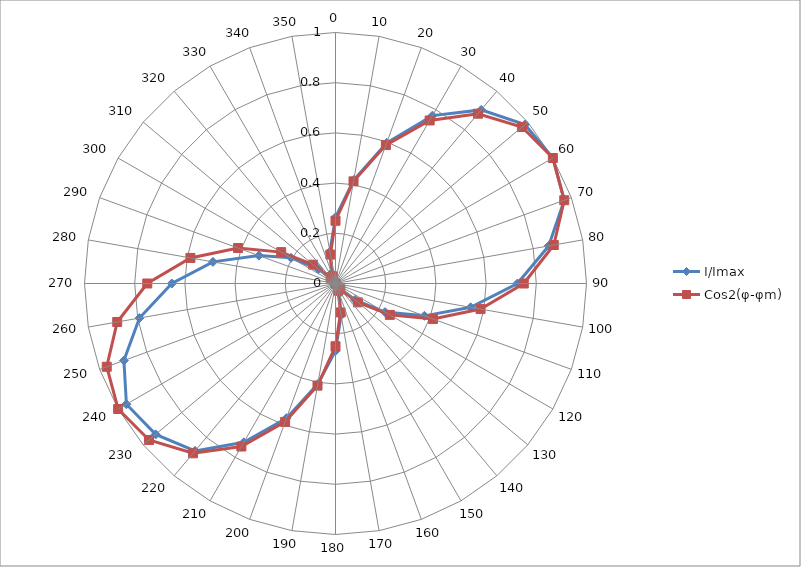
| Category | I/Imax | Cos2(φ-φm) |
|---|---|---|
| 0.0 | 0.264 | 0.25 |
| 10.0 | 0.418 | 0.413 |
| 20.0 | 0.597 | 0.587 |
| 30.0 | 0.772 | 0.75 |
| 40.0 | 0.903 | 0.883 |
| 50.0 | 0.985 | 0.97 |
| 60.0 | 1 | 1 |
| 70.0 | 0.97 | 0.97 |
| 80.0 | 0.862 | 0.883 |
| 90.0 | 0.725 | 0.75 |
| 100.0 | 0.547 | 0.587 |
| 110.0 | 0.377 | 0.413 |
| 120.0 | 0.228 | 0.25 |
| 130.0 | 0.102 | 0.117 |
| 140.0 | 0.023 | 0.03 |
| 150.0 | 0.005 | 0 |
| 160.0 | 0.043 | 0.03 |
| 170.0 | 0.128 | 0.117 |
| 180.0 | 0.268 | 0.25 |
| 190.0 | 0.407 | 0.413 |
| 200.0 | 0.571 | 0.587 |
| 210.0 | 0.731 | 0.75 |
| 220.0 | 0.871 | 0.883 |
| 230.0 | 0.935 | 0.97 |
| 240.0 | 0.962 | 1 |
| 250.0 | 0.897 | 0.97 |
| 260.0 | 0.793 | 0.883 |
| 270.0 | 0.652 | 0.75 |
| 280.0 | 0.496 | 0.587 |
| 290.0 | 0.325 | 0.413 |
| 300.0 | 0.205 | 0.25 |
| 310.0 | 0.089 | 0.117 |
| 320.0 | 0.02 | 0.03 |
| 330.0 | 0.005 | 0 |
| 340.0 | 0.045 | 0.03 |
| 350.0 | 0.128 | 0.117 |